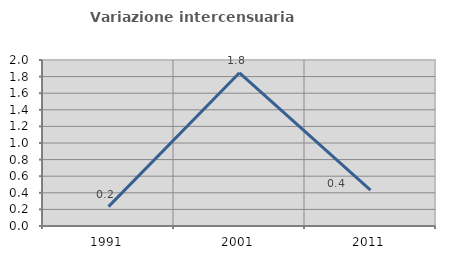
| Category | Variazione intercensuaria annua |
|---|---|
| 1991.0 | 0.233 |
| 2001.0 | 1.846 |
| 2011.0 | 0.431 |